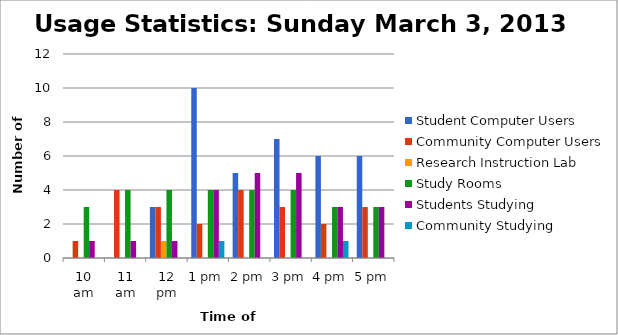
| Category | Student Computer Users | Community Computer Users | Research Instruction Lab | Study Rooms | Students Studying | Community Studying |
|---|---|---|---|---|---|---|
| 10 am | 0 | 1 | 0 | 3 | 1 | 0 |
| 11 am | 0 | 4 | 0 | 4 | 1 | 0 |
| 12 pm | 3 | 3 | 1 | 4 | 1 | 0 |
| 1 pm | 10 | 2 | 0 | 4 | 4 | 1 |
| 2 pm | 5 | 4 | 0 | 4 | 5 | 0 |
| 3 pm | 7 | 3 | 0 | 4 | 5 | 0 |
| 4 pm | 6 | 2 | 0 | 3 | 3 | 1 |
| 5 pm | 6 | 3 | 0 | 3 | 3 | 0 |